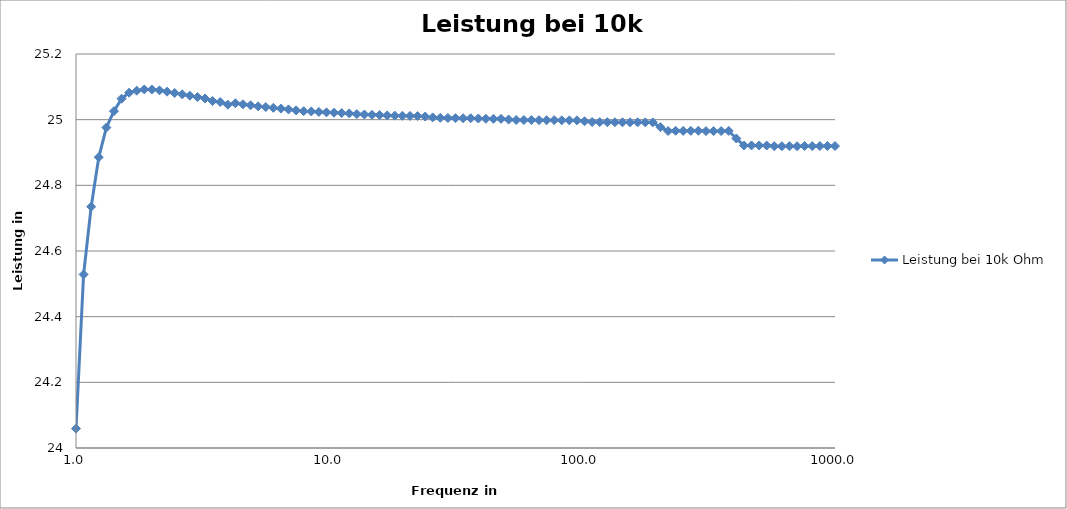
| Category | Leistung bei 10k Ohm |
|---|---|
| 1.0 | 24.059 |
| 1.0715193052376064 | 24.528 |
| 1.1481536214968828 | 24.735 |
| 1.2302687708123816 | 24.886 |
| 1.3182567385564072 | 24.976 |
| 1.4125375446227544 | 25.026 |
| 1.5135612484362082 | 25.064 |
| 1.62181009735893 | 25.082 |
| 1.7378008287493756 | 25.088 |
| 1.8620871366628675 | 25.092 |
| 1.9952623149688797 | 25.092 |
| 2.137962089502232 | 25.089 |
| 2.290867652767773 | 25.085 |
| 2.4547089156850306 | 25.081 |
| 2.630267991895382 | 25.077 |
| 2.818382931264454 | 25.073 |
| 3.0199517204020165 | 25.069 |
| 3.2359365692962836 | 25.064 |
| 3.467368504525317 | 25.057 |
| 3.7153522909717256 | 25.054 |
| 3.9810717055349727 | 25.046 |
| 4.265795188015927 | 25.05 |
| 4.570881896148751 | 25.047 |
| 4.8977881936844625 | 25.044 |
| 5.248074602497726 | 25.04 |
| 5.623413251903492 | 25.038 |
| 6.02559586074358 | 25.036 |
| 6.456542290346557 | 25.034 |
| 6.918309709189367 | 25.031 |
| 7.4131024130091765 | 25.028 |
| 7.943282347242818 | 25.026 |
| 8.511380382023768 | 25.025 |
| 9.120108393559098 | 25.024 |
| 9.77237220955811 | 25.022 |
| 10.471285480509 | 25.021 |
| 11.220184543019636 | 25.02 |
| 12.022644346174133 | 25.019 |
| 12.882495516931346 | 25.017 |
| 13.803842646028851 | 25.016 |
| 14.791083881682074 | 25.015 |
| 15.848931924611136 | 25.014 |
| 16.982436524617448 | 25.013 |
| 18.19700858609984 | 25.012 |
| 19.498445997580465 | 25.012 |
| 20.8929613085404 | 25.011 |
| 22.387211385683404 | 25.011 |
| 23.988329190194907 | 25.009 |
| 25.703957827688647 | 25.007 |
| 27.542287033381665 | 25.006 |
| 29.512092266663863 | 25.005 |
| 31.622776601683803 | 25.005 |
| 33.88441561392027 | 25.004 |
| 36.307805477010156 | 25.004 |
| 38.904514499428075 | 25.004 |
| 41.68693834703356 | 25.003 |
| 44.668359215096324 | 25.003 |
| 47.863009232263856 | 25.002 |
| 51.28613839913649 | 25 |
| 54.95408738576247 | 24.999 |
| 58.88436553555895 | 24.999 |
| 63.095734448019364 | 24.999 |
| 67.60829753919819 | 24.998 |
| 72.44359600749907 | 24.998 |
| 77.62471166286922 | 24.998 |
| 83.17637711026713 | 24.998 |
| 89.12509381337456 | 24.998 |
| 95.49925860214366 | 24.998 |
| 102.32929922807544 | 24.995 |
| 109.6478196143186 | 24.993 |
| 117.48975549395293 | 24.993 |
| 125.89254117941677 | 24.992 |
| 134.89628825916537 | 24.992 |
| 144.54397707459285 | 24.992 |
| 154.8816618912482 | 24.992 |
| 165.95869074375622 | 24.992 |
| 177.82794100389242 | 24.992 |
| 190.5460717963248 | 24.992 |
| 204.17379446695315 | 24.977 |
| 218.77616239495524 | 24.966 |
| 234.42288153199232 | 24.966 |
| 251.18864315095806 | 24.966 |
| 269.1534803926918 | 24.966 |
| 288.4031503126607 | 24.966 |
| 309.02954325135937 | 24.965 |
| 331.13112148259137 | 24.965 |
| 354.81338923357566 | 24.965 |
| 380.1893963205616 | 24.966 |
| 407.3802778041127 | 24.943 |
| 436.5158322401662 | 24.921 |
| 467.7351412871983 | 24.921 |
| 501.1872336272727 | 24.921 |
| 537.031796370253 | 24.921 |
| 575.4399373371571 | 24.919 |
| 616.5950018614827 | 24.919 |
| 660.6934480075964 | 24.919 |
| 707.9457843841387 | 24.919 |
| 758.5775750291838 | 24.92 |
| 812.8305161640998 | 24.92 |
| 870.9635899560809 | 24.92 |
| 933.254300796992 | 24.92 |
| 1000.0 | 24.92 |